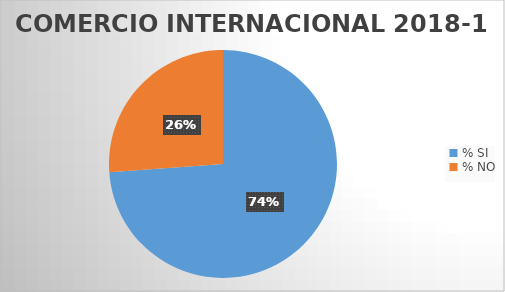
| Category | Series 0 |
|---|---|
| % SI | 73.864 |
| % NO | 26.136 |